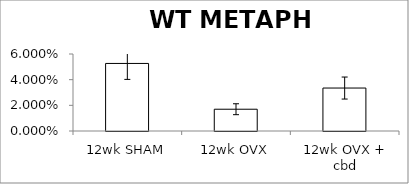
| Category | METAPH |
|---|---|
| 12wk SHAM | 0.053 |
| 12wk OVX | 0.017 |
| 12wk OVX + cbd | 0.033 |